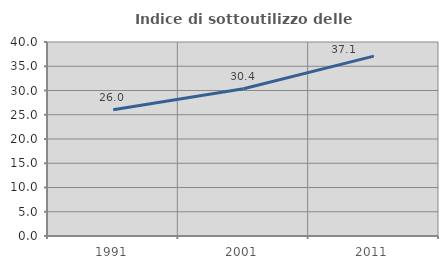
| Category | Indice di sottoutilizzo delle abitazioni  |
|---|---|
| 1991.0 | 26.03 |
| 2001.0 | 30.357 |
| 2011.0 | 37.082 |